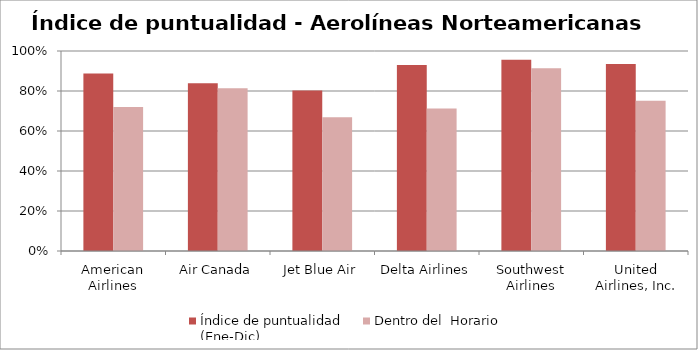
| Category | Índice de puntualidad
(Ene-Dic) | Dentro del  Horario |
|---|---|---|
| American Airlines | 0.887 | 0.72 |
| Air Canada | 0.839 | 0.814 |
| Jet Blue Air | 0.802 | 0.669 |
| Delta Airlines | 0.931 | 0.713 |
| Southwest Airlines | 0.957 | 0.914 |
| United Airlines, Inc. | 0.934 | 0.751 |